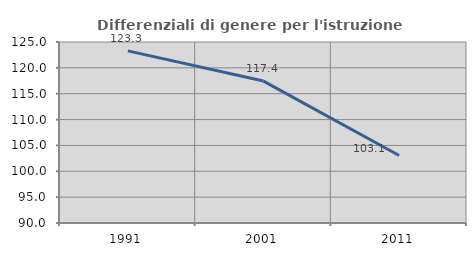
| Category | Differenziali di genere per l'istruzione superiore |
|---|---|
| 1991.0 | 123.29 |
| 2001.0 | 117.442 |
| 2011.0 | 103.057 |